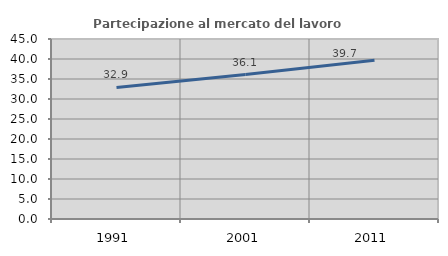
| Category | Partecipazione al mercato del lavoro  femminile |
|---|---|
| 1991.0 | 32.889 |
| 2001.0 | 36.122 |
| 2011.0 | 39.677 |